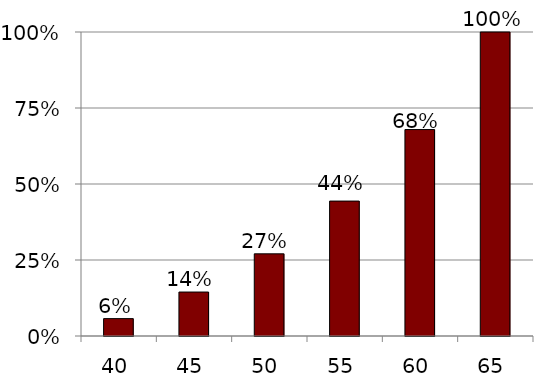
| Category | Series 0 |
|---|---|
| 40.0 | 0.057 |
| 45.0 | 0.145 |
| 50.0 | 0.27 |
| 55.0 | 0.444 |
| 60.0 | 0.679 |
| 65.0 | 1 |